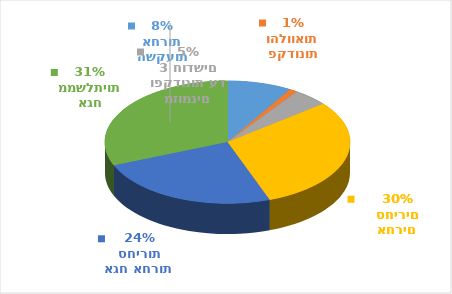
| Category | Series 0 | Series 1 |
|---|---|---|
| השקעות אחרות | 11600.005 | 0.085 |
| פקדונות והלוואות | 1442.837 | 0.011 |
| מזומנים ופקדונות עד 3 חודשים | 6379.209 | 0.047 |
| ניירות ערך אחרים סחירים | 41353.606 | 0.302 |
| אגח אחרות סחירות | 33364.549 | 0.244 |
| אגח ממשלתיות | 42646.934 | 0.312 |